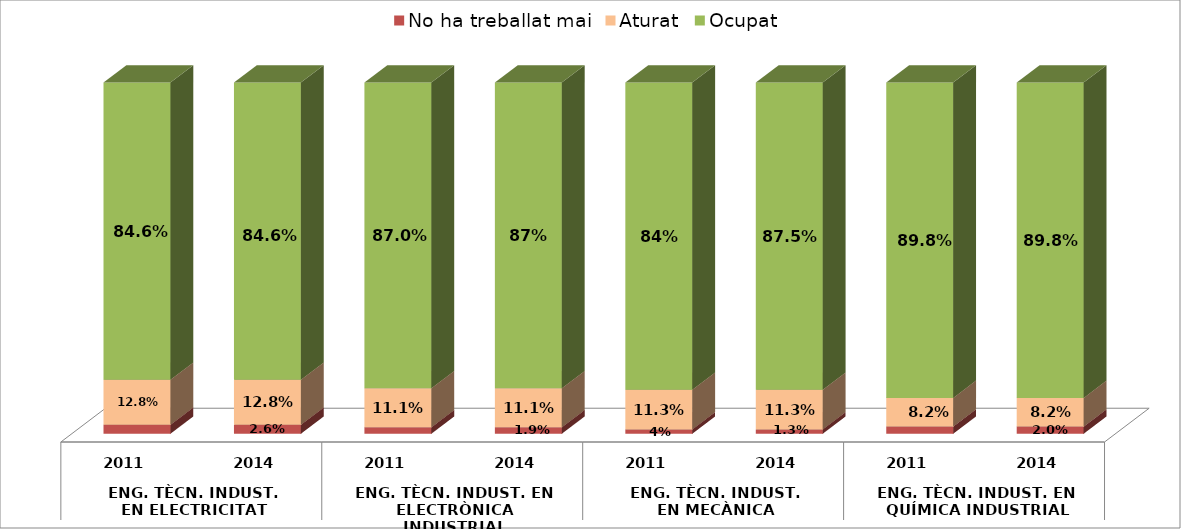
| Category | No ha treballat mai | Aturat | Ocupat |
|---|---|---|---|
| 0 | 0.026 | 0.128 | 0.846 |
| 1 | 0.026 | 0.128 | 0.846 |
| 2 | 0.019 | 0.111 | 0.87 |
| 3 | 0.019 | 0.111 | 0.87 |
| 4 | 0.012 | 0.112 | 0.875 |
| 5 | 0.012 | 0.112 | 0.875 |
| 6 | 0.02 | 0.082 | 0.898 |
| 7 | 0.02 | 0.082 | 0.898 |